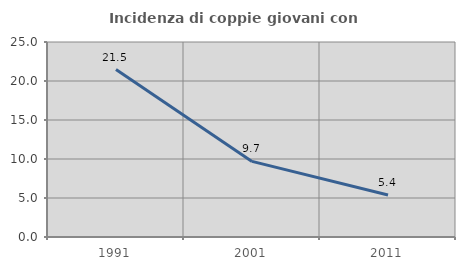
| Category | Incidenza di coppie giovani con figli |
|---|---|
| 1991.0 | 21.465 |
| 2001.0 | 9.691 |
| 2011.0 | 5.389 |